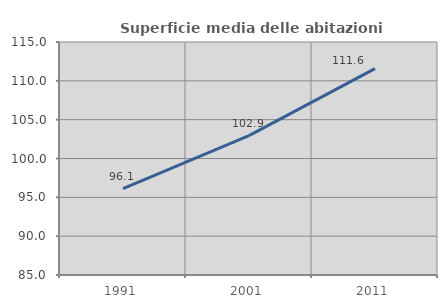
| Category | Superficie media delle abitazioni occupate |
|---|---|
| 1991.0 | 96.128 |
| 2001.0 | 102.95 |
| 2011.0 | 111.573 |